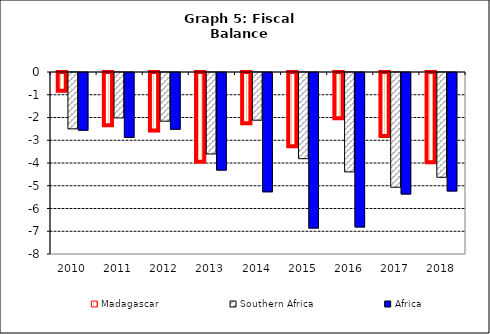
| Category | Madagascar | Southern Africa | Africa |
|---|---|---|---|
| 2010.0 | -0.869 | -2.477 | -2.535 |
| 2011.0 | -2.386 | -1.995 | -2.853 |
| 2012.0 | -2.612 | -2.14 | -2.495 |
| 2013.0 | -3.988 | -3.581 | -4.291 |
| 2014.0 | -2.3 | -2.096 | -5.245 |
| 2015.0 | -3.312 | -3.788 | -6.84 |
| 2016.0 | -2.077 | -4.368 | -6.79 |
| 2017.0 | -2.862 | -5.043 | -5.342 |
| 2018.0 | -4.01 | -4.606 | -5.208 |